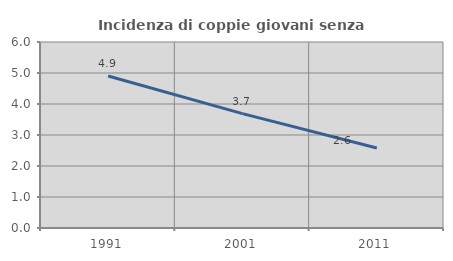
| Category | Incidenza di coppie giovani senza figli |
|---|---|
| 1991.0 | 4.905 |
| 2001.0 | 3.689 |
| 2011.0 | 2.582 |